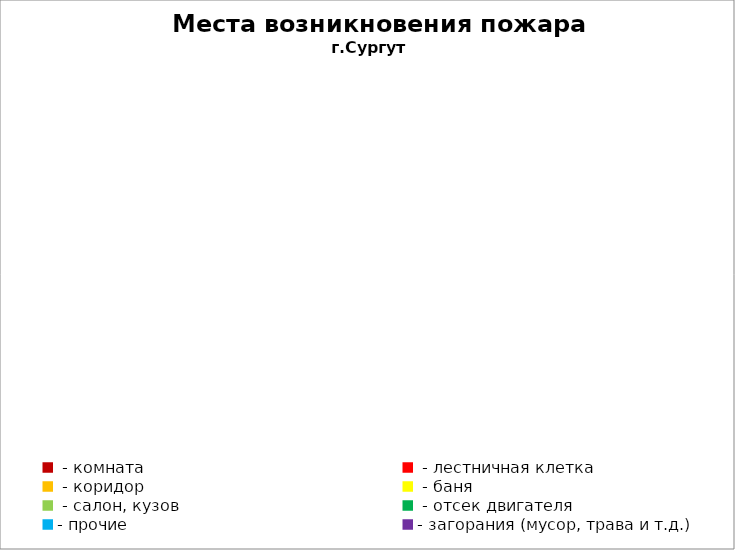
| Category | Места возникновения пожара |
|---|---|
|  - комната | 45 |
|  - лестничная клетка | 4 |
|  - коридор | 3 |
|  - баня | 16 |
|  - салон, кузов | 10 |
|  - отсек двигателя | 19 |
| - прочие | 60 |
| - загорания (мусор, трава и т.д.)  | 80 |